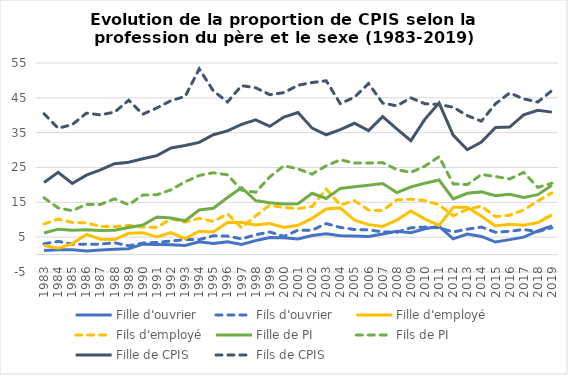
| Category | Fille d'ouvrier | Fils d'ouvrier | Fille d'employé | Fils d'employé | Fille de PI | Fils de PI | Fille de CPIS | Fils de CPIS |
|---|---|---|---|---|---|---|---|---|
| 1983.0 | 1.2 | 3.1 | 2.6 | 8.8 | 6.2 | 16.3 | 20.7 | 40.4 |
| 1984.0 | 1.4 | 3.8 | 1.8 | 10.2 | 7.3 | 13.4 | 23.6 | 36.3 |
| 1985.0 | 1.4 | 3 | 3.1 | 9.2 | 7 | 12.6 | 20.4 | 37.3 |
| 1986.0 | 1 | 3 | 5.8 | 9.1 | 7.1 | 14.4 | 22.8 | 40.6 |
| 1987.0 | 1.3 | 3 | 4.4 | 8.1 | 6.9 | 14.4 | 24.3 | 40.1 |
| 1988.0 | 1.5 | 3.4 | 4.3 | 8 | 7 | 16 | 26.1 | 40.9 |
| 1989.0 | 1.7 | 2.5 | 6.1 | 8.4 | 7.8 | 14.3 | 26.5 | 44.3 |
| 1990.0 | 3 | 3.3 | 6.3 | 7.9 | 8.5 | 17.1 | 27.5 | 40.3 |
| 1991.0 | 2.9 | 3.5 | 5.1 | 7.8 | 10.8 | 17.2 | 28.4 | 42.1 |
| 1992.0 | 2.8 | 3.9 | 6.3 | 10.3 | 10.5 | 18.6 | 30.6 | 44.2 |
| 1993.0 | 2.6 | 4.3 | 4.6 | 9.3 | 9.7 | 20.9 | 31.3 | 45.4 |
| 1994.0 | 3.7 | 4.3 | 6.7 | 10.4 | 12.8 | 22.7 | 32.2 | 53.3 |
| 1995.0 | 3.2 | 5.4 | 6.5 | 9.5 | 13.3 | 23.5 | 34.4 | 47 |
| 1996.0 | 3.7 | 5.3 | 9.2 | 11.7 | 16.4 | 22.9 | 35.5 | 43.8 |
| 1997.0 | 2.9 | 4.5 | 9.3 | 7.7 | 19.2 | 18.5 | 37.4 | 48.5 |
| 1998.0 | 4 | 5.7 | 8.5 | 11.1 | 15.5 | 17.9 | 38.7 | 47.9 |
| 1999.0 | 4.9 | 6.5 | 8.9 | 14.2 | 14.9 | 22.3 | 36.8 | 45.9 |
| 2000.0 | 4.8 | 5.2 | 7.8 | 13.5 | 14.5 | 25.5 | 39.5 | 46.5 |
| 2001.0 | 4.5 | 7 | 8.4 | 13.2 | 14.6 | 24.6 | 40.8 | 48.6 |
| 2002.0 | 5.5 | 7 | 10.4 | 13.8 | 17.6 | 23.1 | 36.3 | 49.4 |
| 2003.0 | 6 | 8.9 | 13.1 | 18.8 | 16.1 | 25.5 | 34.4 | 49.9 |
| 2004.0 | 5.4 | 7.8 | 13.4 | 14.2 | 19 | 27.2 | 35.9 | 43.3 |
| 2005.0 | 5.3 | 7.2 | 9.9 | 15.5 | 19.5 | 26.3 | 37.7 | 45.2 |
| 2006.0 | 5.2 | 7.1 | 8.6 | 12.8 | 19.9 | 26.3 | 35.6 | 49.1 |
| 2007.0 | 5.9 | 6.5 | 8.1 | 12.6 | 20.4 | 26.4 | 39.6 | 43.5 |
| 2008.0 | 6.7 | 6.4 | 9.9 | 15.7 | 17.8 | 24.4 | 36.1 | 42.7 |
| 2009.0 | 6.3 | 7.7 | 12.5 | 15.9 | 19.4 | 23.6 | 32.7 | 45 |
| 2010.0 | 7.4 | 7.9 | 10.2 | 15.5 | 20.5 | 25.4 | 38.9 | 43.3 |
| 2011.0 | 8.1 | 7.7 | 8.4 | 14.3 | 21.4 | 28.1 | 43.5 | 43.1 |
| 2012.0 | 4.5 | 6.5 | 13.6 | 11.1 | 16 | 20.3 | 34.3 | 42.3 |
| 2013.0 | 5.9 | 7.3 | 13.6 | 13 | 17.6 | 20.1 | 30.1 | 39.9 |
| 2014.0 | 5.2 | 7.9 | 11 | 13.9 | 18 | 23 | 32.3 | 38.3 |
| 2015.0 | 3.6 | 6.4 | 8.2 | 10.9 | 16.9 | 22.4 | 36.5 | 43.3 |
| 2016.0 | 4.3 | 6.7 | 8.7 | 11.3 | 17.3 | 21.7 | 36.6 | 46.4 |
| 2017.0 | 5 | 7.2 | 8.4 | 12.8 | 16.4 | 23.6 | 40.1 | 44.7 |
| 2018.0 | 6.8 | 6.6 | 9.2 | 15.4 | 17.2 | 19.3 | 41.4 | 43.8 |
| 2019.0 | 8.2 | 7.7 | 11.4 | 17.7 | 19.9 | 20.5 | 40.9 | 47.1 |